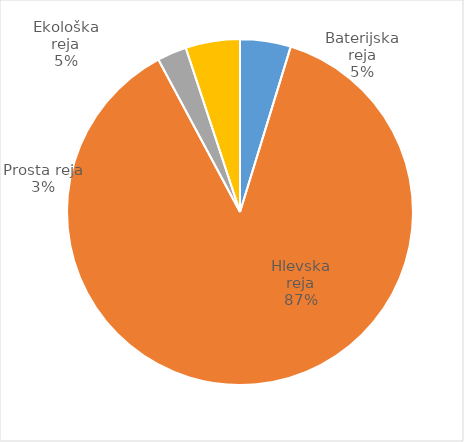
| Category | Število kosov jajc |
|---|---|
| Baterijska reja | 143647 |
| Hlevska reja | 2651090 |
| Prosta reja | 83367 |
| Ekološka reja | 154020 |